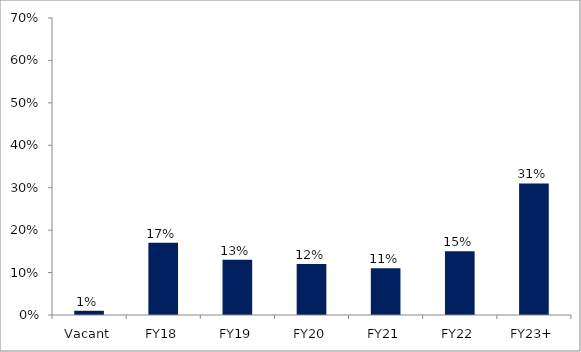
| Category | Series 0 |
|---|---|
| Vacant | 0.01 |
| FY18 | 0.17 |
| FY19 | 0.13 |
| FY20 | 0.12 |
| FY21 | 0.11 |
| FY22 | 0.15 |
| FY23+ | 0.31 |